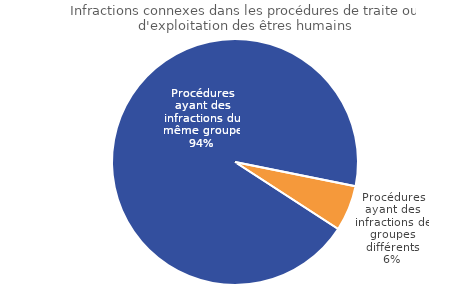
| Category | Series 0 |
|---|---|
| Procédures ayant des infractions du même groupe | 94 |
| Procédures ayant des infractions de groupes différents | 6 |